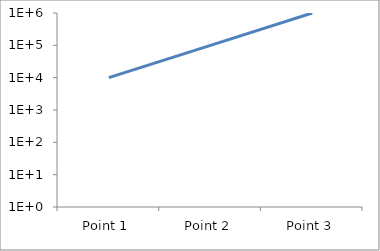
| Category | Series 3 |
|---|---|
| Point 1 | 10000 |
| Point 2 | 100000 |
| Point 3 | 1000000 |